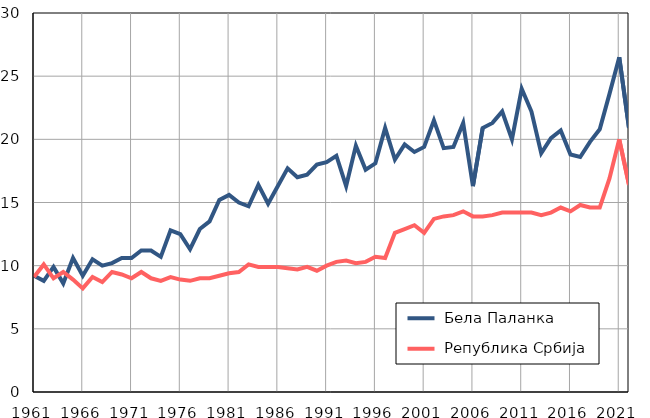
| Category |  Бела Паланка |  Република Србија |
|---|---|---|
| 1961.0 | 9.2 | 9.1 |
| 1962.0 | 8.8 | 10.1 |
| 1963.0 | 9.9 | 9 |
| 1964.0 | 8.6 | 9.5 |
| 1965.0 | 10.6 | 8.9 |
| 1966.0 | 9.2 | 8.2 |
| 1967.0 | 10.5 | 9.1 |
| 1968.0 | 10 | 8.7 |
| 1969.0 | 10.2 | 9.5 |
| 1970.0 | 10.6 | 9.3 |
| 1971.0 | 10.6 | 9 |
| 1972.0 | 11.2 | 9.5 |
| 1973.0 | 11.2 | 9 |
| 1974.0 | 10.7 | 8.8 |
| 1975.0 | 12.8 | 9.1 |
| 1976.0 | 12.5 | 8.9 |
| 1977.0 | 11.3 | 8.8 |
| 1978.0 | 12.9 | 9 |
| 1979.0 | 13.5 | 9 |
| 1980.0 | 15.2 | 9.2 |
| 1981.0 | 15.6 | 9.4 |
| 1982.0 | 15 | 9.5 |
| 1983.0 | 14.7 | 10.1 |
| 1984.0 | 16.4 | 9.9 |
| 1985.0 | 14.9 | 9.9 |
| 1986.0 | 16.3 | 9.9 |
| 1987.0 | 17.7 | 9.8 |
| 1988.0 | 17 | 9.7 |
| 1989.0 | 17.2 | 9.9 |
| 1990.0 | 18 | 9.6 |
| 1991.0 | 18.2 | 10 |
| 1992.0 | 18.7 | 10.3 |
| 1993.0 | 16.3 | 10.4 |
| 1994.0 | 19.5 | 10.2 |
| 1995.0 | 17.6 | 10.3 |
| 1996.0 | 18.1 | 10.7 |
| 1997.0 | 20.9 | 10.6 |
| 1998.0 | 18.4 | 12.6 |
| 1999.0 | 19.6 | 12.9 |
| 2000.0 | 19 | 13.2 |
| 2001.0 | 19.4 | 12.6 |
| 2002.0 | 21.5 | 13.7 |
| 2003.0 | 19.3 | 13.9 |
| 2004.0 | 19.4 | 14 |
| 2005.0 | 21.3 | 14.3 |
| 2006.0 | 16.3 | 13.9 |
| 2007.0 | 20.9 | 13.9 |
| 2008.0 | 21.3 | 14 |
| 2009.0 | 22.2 | 14.2 |
| 2010.0 | 20 | 14.2 |
| 2011.0 | 24 | 14.2 |
| 2012.0 | 22.2 | 14.2 |
| 2013.0 | 18.9 | 14 |
| 2014.0 | 20.1 | 14.2 |
| 2015.0 | 20.7 | 14.6 |
| 2016.0 | 18.8 | 14.3 |
| 2017.0 | 18.6 | 14.8 |
| 2018.0 | 19.8 | 14.6 |
| 2019.0 | 20.8 | 14.6 |
| 2020.0 | 23.6 | 16.9 |
| 2021.0 | 26.5 | 20 |
| 2022.0 | 20.9 | 16.4 |